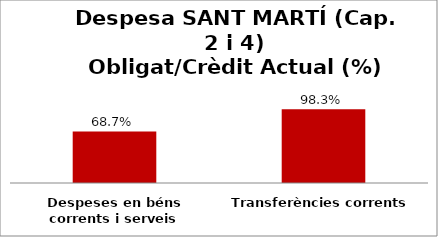
| Category | Series 0 |
|---|---|
| Despeses en béns corrents i serveis | 0.687 |
| Transferències corrents | 0.983 |